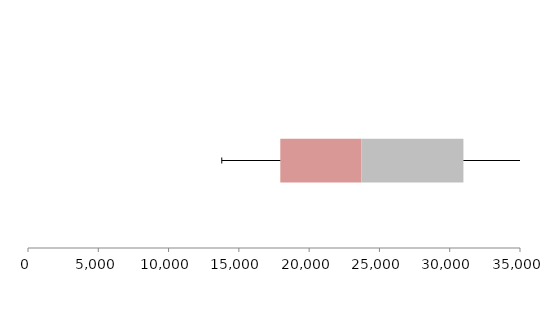
| Category | Series 1 | Series 2 | Series 3 |
|---|---|---|---|
| 0 | 17948.524 | 5770.763 | 7255.679 |